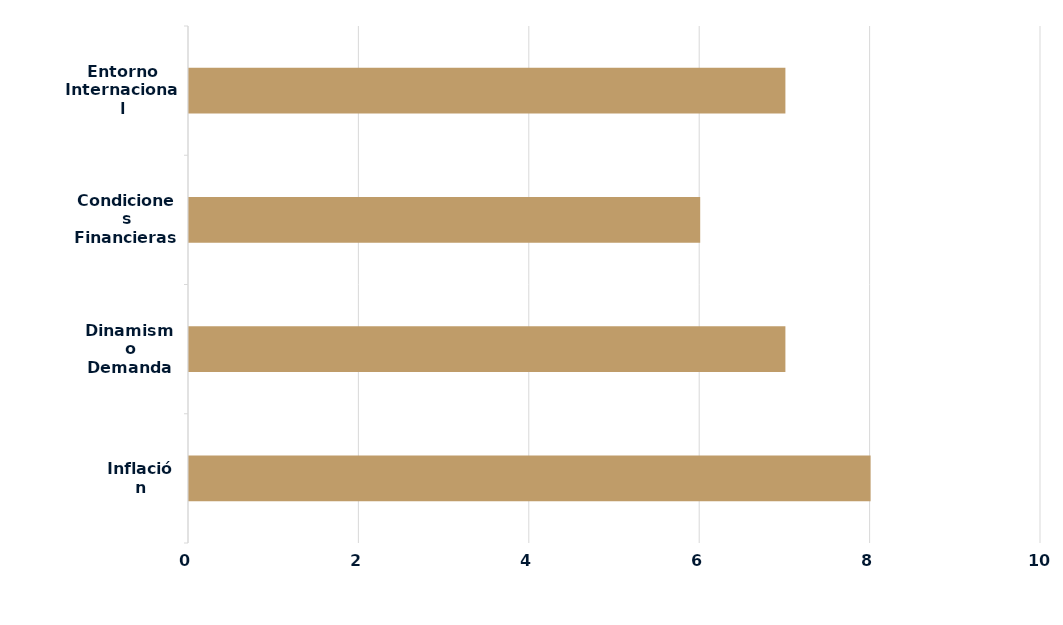
| Category | Series 0 |
|---|---|
| Inflación | 8 |
| Dinamismo Demanda | 7 |
| Condiciones Financieras Locales | 6 |
| Entorno Internacional | 7 |